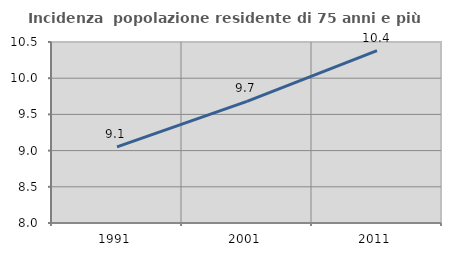
| Category | Incidenza  popolazione residente di 75 anni e più |
|---|---|
| 1991.0 | 9.051 |
| 2001.0 | 9.681 |
| 2011.0 | 10.38 |